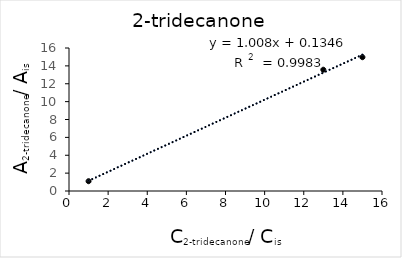
| Category | Series 0 |
|---|---|
| 1.0 | 1.095 |
| 13.0 | 13.57 |
| 15.0 | 14.97 |